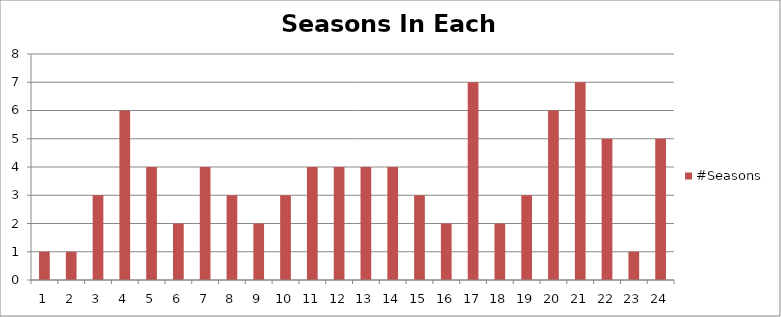
| Category | #Seasons |
|---|---|
| 0 | 1 |
| 1 | 1 |
| 2 | 3 |
| 3 | 6 |
| 4 | 4 |
| 5 | 2 |
| 6 | 4 |
| 7 | 3 |
| 8 | 2 |
| 9 | 3 |
| 10 | 4 |
| 11 | 4 |
| 12 | 4 |
| 13 | 4 |
| 14 | 3 |
| 15 | 2 |
| 16 | 7 |
| 17 | 2 |
| 18 | 3 |
| 19 | 6 |
| 20 | 7 |
| 21 | 5 |
| 22 | 1 |
| 23 | 5 |